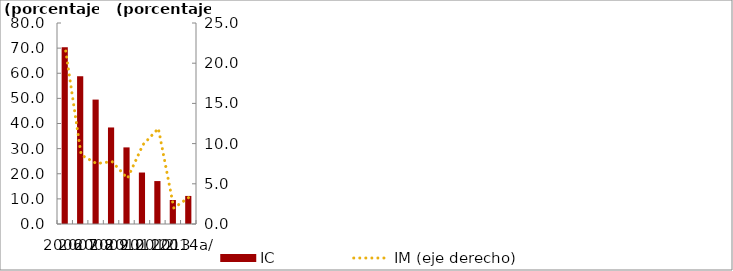
| Category | IC |
|---|---|
| 2006 | 70.312 |
| 2007 | 58.846 |
| 2008 | 49.515 |
| 2009 | 38.421 |
| 2010 | 30.492 |
| 2011 | 20.486 |
| 2012 | 17.087 |
| 2013 | 9.548 |
| 2014a/ | 11.175 |